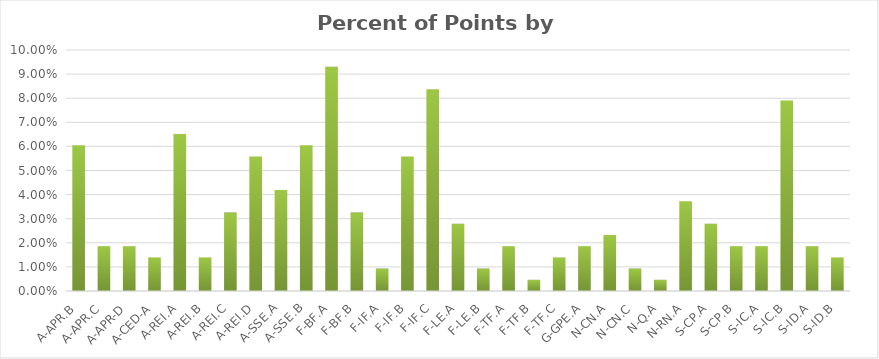
| Category | Percent |
|---|---|
| A-APR.B | 0.06 |
| A-APR.C | 0.019 |
| A-APR-D | 0.019 |
| A-CED-A | 0.014 |
| A-REI.A | 0.065 |
| A-REI.B | 0.014 |
| A-REI.C | 0.033 |
| A-REI.D | 0.056 |
| A-SSE.A | 0.042 |
| A-SSE.B | 0.06 |
| F-BF.A | 0.093 |
| F-BF.B | 0.033 |
| F-IF.A | 0.009 |
| F-IF.B | 0.056 |
| F-IF.C | 0.084 |
| F-LE.A | 0.028 |
| F-LE.B | 0.009 |
| F-TF.A | 0.019 |
| F-TF.B | 0.005 |
| F-TF.C | 0.014 |
| G-GPE.A | 0.019 |
| N-CN.A | 0.023 |
| N-CN.C | 0.009 |
| N-Q.A | 0.005 |
| N-RN.A | 0.037 |
| S-CP.A | 0.028 |
| S-CP.B | 0.019 |
| S-IC.A | 0.019 |
| S-IC.B | 0.079 |
| S-ID.A | 0.019 |
| S-ID.B | 0.014 |